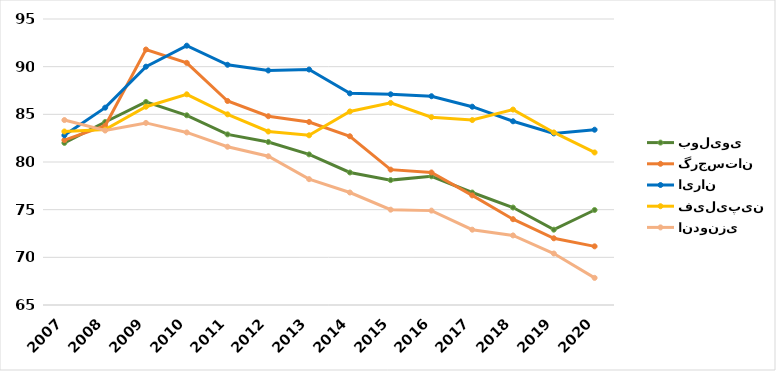
| Category | بولیوی | گرجستان | ایران | فیلیپین | اندونزی |
|---|---|---|---|---|---|
| 2007.0 | 82 | 82.3 | 82.8 | 83.2 | 84.4 |
| 2008.0 | 84.2 | 83.8 | 85.7 | 83.4 | 83.3 |
| 2009.0 | 86.3 | 91.8 | 90 | 85.8 | 84.1 |
| 2010.0 | 84.9 | 90.4 | 92.2 | 87.1 | 83.1 |
| 2011.0 | 82.9 | 86.4 | 90.2 | 85 | 81.6 |
| 2012.0 | 82.1 | 84.8 | 89.6 | 83.2 | 80.6 |
| 2013.0 | 80.8 | 84.2 | 89.7 | 82.8 | 78.2 |
| 2014.0 | 78.9 | 82.7 | 87.2 | 85.3 | 76.8 |
| 2015.0 | 78.1 | 79.2 | 87.1 | 86.2 | 75 |
| 2016.0 | 78.5 | 78.9 | 86.9 | 84.7 | 74.9 |
| 2017.0 | 76.8 | 76.5 | 85.8 | 84.4 | 72.9 |
| 2018.0 | 75.223 | 74 | 84.271 | 85.5 | 72.298 |
| 2019.0 | 72.9 | 72 | 83 | 83.1 | 70.4 |
| 2020.0 | 74.967 | 71.152 | 83.387 | 81 | 67.846 |